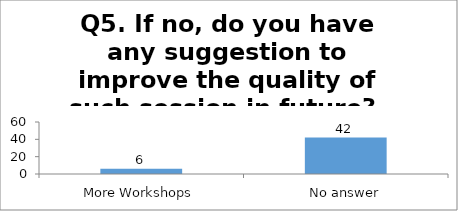
| Category | Q5. If no, do you have any suggestion to improve the quality of such session in future?  |
|---|---|
| More Workshops | 6 |
| No answer | 42 |